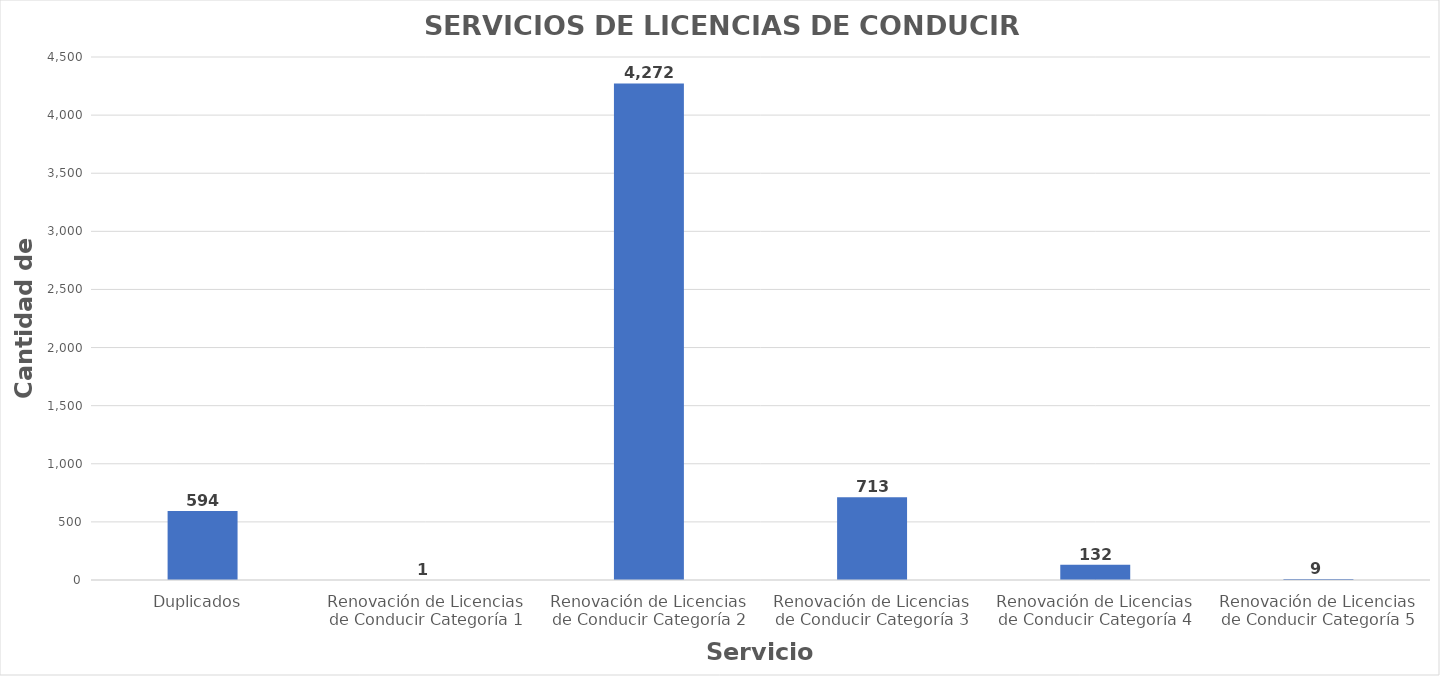
| Category | Series 0 |
|---|---|
| Duplicados  | 594 |
| Renovación de Licencias de Conducir Categoría 1 | 1 |
| Renovación de Licencias de Conducir Categoría 2 | 4272 |
| Renovación de Licencias de Conducir Categoría 3 | 713 |
| Renovación de Licencias de Conducir Categoría 4 | 132 |
| Renovación de Licencias de Conducir Categoría 5 | 9 |